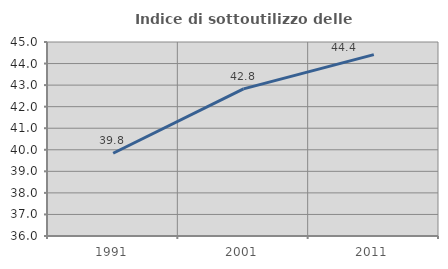
| Category | Indice di sottoutilizzo delle abitazioni  |
|---|---|
| 1991.0 | 39.839 |
| 2001.0 | 42.826 |
| 2011.0 | 44.415 |